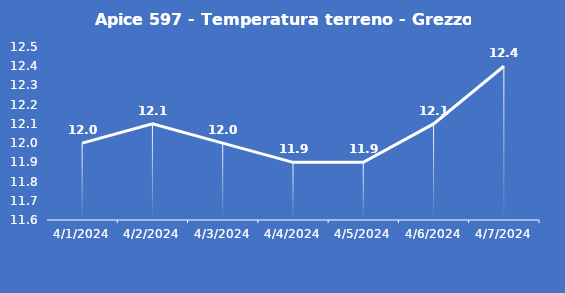
| Category | Apice 597 - Temperatura terreno - Grezzo (°C) |
|---|---|
| 4/1/24 | 12 |
| 4/2/24 | 12.1 |
| 4/3/24 | 12 |
| 4/4/24 | 11.9 |
| 4/5/24 | 11.9 |
| 4/6/24 | 12.1 |
| 4/7/24 | 12.4 |